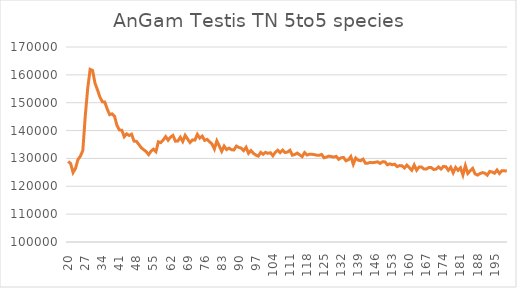
| Category | Series 1 |
|---|---|
| 20.0 | 128932 |
| 21.0 | 128106 |
| 22.0 | 124934 |
| 23.0 | 126448 |
| 24.0 | 129591 |
| 25.0 | 130836 |
| 26.0 | 132872 |
| 27.0 | 145258 |
| 28.0 | 155167 |
| 29.0 | 161979 |
| 30.0 | 161572 |
| 31.0 | 156973 |
| 32.0 | 154631 |
| 33.0 | 152038 |
| 34.0 | 150318 |
| 35.0 | 150244 |
| 36.0 | 147773 |
| 37.0 | 145714 |
| 38.0 | 146008 |
| 39.0 | 145166 |
| 40.0 | 141863 |
| 41.0 | 140201 |
| 42.0 | 140115 |
| 43.0 | 137793 |
| 44.0 | 138825 |
| 45.0 | 138239 |
| 46.0 | 138702 |
| 47.0 | 136230 |
| 48.0 | 136128 |
| 49.0 | 134991 |
| 50.0 | 133822 |
| 51.0 | 133113 |
| 52.0 | 132439 |
| 53.0 | 131366 |
| 54.0 | 132621 |
| 55.0 | 133333 |
| 56.0 | 132443 |
| 57.0 | 135961 |
| 58.0 | 135682 |
| 59.0 | 136645 |
| 60.0 | 137835 |
| 61.0 | 136532 |
| 62.0 | 137661 |
| 63.0 | 138267 |
| 64.0 | 136180 |
| 65.0 | 136272 |
| 66.0 | 137591 |
| 67.0 | 136068 |
| 68.0 | 138282 |
| 69.0 | 136965 |
| 70.0 | 135711 |
| 71.0 | 136657 |
| 72.0 | 136573 |
| 73.0 | 138628 |
| 74.0 | 137288 |
| 75.0 | 138008 |
| 76.0 | 136471 |
| 77.0 | 136816 |
| 78.0 | 135984 |
| 79.0 | 135203 |
| 80.0 | 133377 |
| 81.0 | 136304 |
| 82.0 | 134461 |
| 83.0 | 132569 |
| 84.0 | 134423 |
| 85.0 | 133174 |
| 86.0 | 133708 |
| 87.0 | 133143 |
| 88.0 | 133027 |
| 89.0 | 134422 |
| 90.0 | 133955 |
| 91.0 | 133717 |
| 92.0 | 132806 |
| 93.0 | 134003 |
| 94.0 | 131842 |
| 95.0 | 132832 |
| 96.0 | 131829 |
| 97.0 | 131223 |
| 98.0 | 130819 |
| 99.0 | 132178 |
| 100.0 | 131489 |
| 101.0 | 132197 |
| 102.0 | 131821 |
| 103.0 | 132057 |
| 104.0 | 130963 |
| 105.0 | 132199 |
| 106.0 | 132934 |
| 107.0 | 132082 |
| 108.0 | 133004 |
| 109.0 | 132122 |
| 110.0 | 132284 |
| 111.0 | 132928 |
| 112.0 | 131151 |
| 113.0 | 131425 |
| 114.0 | 131912 |
| 115.0 | 131298 |
| 116.0 | 130636 |
| 117.0 | 132095 |
| 118.0 | 131203 |
| 119.0 | 131504 |
| 120.0 | 131491 |
| 121.0 | 131372 |
| 122.0 | 131157 |
| 123.0 | 131108 |
| 124.0 | 131436 |
| 125.0 | 130235 |
| 126.0 | 130493 |
| 127.0 | 130830 |
| 128.0 | 130660 |
| 129.0 | 130481 |
| 130.0 | 130748 |
| 131.0 | 129685 |
| 132.0 | 130239 |
| 133.0 | 130349 |
| 134.0 | 129150 |
| 135.0 | 129517 |
| 136.0 | 130681 |
| 137.0 | 127915 |
| 138.0 | 130146 |
| 139.0 | 129372 |
| 140.0 | 129170 |
| 141.0 | 129745 |
| 142.0 | 128266 |
| 143.0 | 128312 |
| 144.0 | 128572 |
| 145.0 | 128464 |
| 146.0 | 128621 |
| 147.0 | 128769 |
| 148.0 | 128196 |
| 149.0 | 128793 |
| 150.0 | 128755 |
| 151.0 | 127708 |
| 152.0 | 128077 |
| 153.0 | 127724 |
| 154.0 | 127936 |
| 155.0 | 127058 |
| 156.0 | 127423 |
| 157.0 | 127385 |
| 158.0 | 126562 |
| 159.0 | 127610 |
| 160.0 | 126681 |
| 161.0 | 125771 |
| 162.0 | 127651 |
| 163.0 | 125767 |
| 164.0 | 126906 |
| 165.0 | 126912 |
| 166.0 | 126213 |
| 167.0 | 126207 |
| 168.0 | 126719 |
| 169.0 | 126705 |
| 170.0 | 126026 |
| 171.0 | 126165 |
| 172.0 | 126939 |
| 173.0 | 126187 |
| 174.0 | 127136 |
| 175.0 | 127011 |
| 176.0 | 125745 |
| 177.0 | 126830 |
| 178.0 | 124846 |
| 179.0 | 126774 |
| 180.0 | 125716 |
| 181.0 | 126635 |
| 182.0 | 124068 |
| 183.0 | 127412 |
| 184.0 | 124609 |
| 185.0 | 125557 |
| 186.0 | 126408 |
| 187.0 | 124431 |
| 188.0 | 124024 |
| 189.0 | 124554 |
| 190.0 | 124919 |
| 191.0 | 124709 |
| 192.0 | 123991 |
| 193.0 | 125347 |
| 194.0 | 125119 |
| 195.0 | 124686 |
| 196.0 | 125847 |
| 197.0 | 124602 |
| 198.0 | 125593 |
| 199.0 | 125578 |
| 200.0 | 125444 |